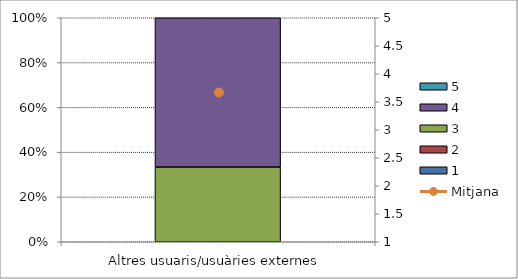
| Category | 1 | 2 | 3 | 4 | 5 |
|---|---|---|---|---|---|
| Altres usuaris/usuàries externes | 0 | 0 | 1 | 2 | 0 |